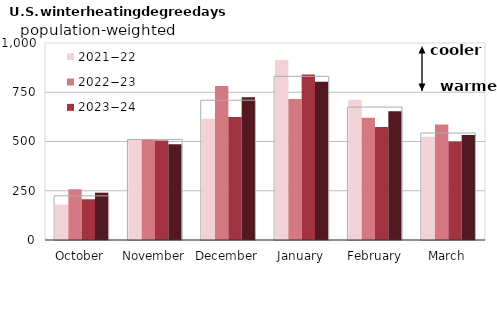
| Category | 2021−22 | 2022−23 | 2023−24 | 2024−25 |
|---|---|---|---|---|
| October | 179.991 | 257.621 | 206.822 | 240.155 |
| November | 509.398 | 511.373 | 504.684 | 486.063 |
| December | 615.697 | 781.206 | 624.2 | 724.566 |
| January | 914.316 | 715.157 | 840.301 | 803.004 |
| February | 712.078 | 620.906 | 573.256 | 653.668 |
| March | 524.74 | 585.747 | 499.888 | 533.017 |